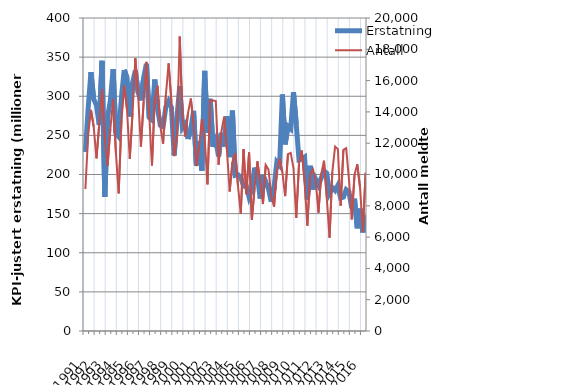
| Category | Erstatning |
|---|---|
| 1991.0 | 228.749 |
| nan | 284.604 |
| nan | 330.774 |
| nan | 296.254 |
| 1992.0 | 288.387 |
| nan | 263.506 |
| nan | 345.323 |
| nan | 171.267 |
| 1993.0 | 273.217 |
| nan | 294.381 |
| nan | 334.687 |
| nan | 252.715 |
| 1994.0 | 248.414 |
| nan | 299.114 |
| nan | 333.638 |
| nan | 323.684 |
| 1995.0 | 274.062 |
| nan | 317.038 |
| nan | 332.935 |
| nan | 304.87 |
| 1996.0 | 294.738 |
| nan | 323.554 |
| nan | 341.375 |
| nan | 272.922 |
| 1997.0 | 269.83 |
| nan | 321.383 |
| nan | 284.465 |
| nan | 262.977 |
| 1998.0 | 261.016 |
| nan | 286.331 |
| nan | 293.608 |
| nan | 285.708 |
| 1999.0 | 224.452 |
| nan | 272.35 |
| nan | 313.004 |
| nan | 259.609 |
| 2000.0 | 264.631 |
| nan | 245.415 |
| nan | 257.428 |
| nan | 281.433 |
| 2001.0 | 211.635 |
| nan | 242.737 |
| nan | 204.98 |
| nan | 332.459 |
| 2002.0 | 253.124 |
| nan | 296.757 |
| nan | 235.339 |
| nan | 244.335 |
| 2003.0 | 223.241 |
| nan | 252.96 |
| nan | 235.873 |
| nan | 274.261 |
| 2004.0 | 222.116 |
| nan | 281.572 |
| nan | 198.937 |
| nan | 199.767 |
| 2005.0 | 196.359 |
| nan | 185.065 |
| nan | 185.833 |
| nan | 171.134 |
| 2006.0 | 180.565 |
| nan | 208.811 |
| nan | 199.152 |
| nan | 169.287 |
| 2007.0 | 199.17 |
| nan | 190.26 |
| nan | 181.455 |
| nan | 165.26 |
| 2008.0 | 183.609 |
| nan | 215.888 |
| nan | 211.574 |
| nan | 302.246 |
| 2009.0 | 238.443 |
| nan | 261.694 |
| nan | 258.418 |
| nan | 305.219 |
| 2010.0 | 264.067 |
| nan | 218.648 |
| nan | 219.545 |
| nan | 222.163 |
| 2011.0 | 168.039 |
| nan | 211.087 |
| nan | 180.746 |
| nan | 194.01 |
| 2012.0 | 186.546 |
| nan | 195.537 |
| nan | 204.354 |
| nan | 201.669 |
| 2013.0 | 176.429 |
| nan | 183.382 |
| nan | 179.613 |
| nan | 186.09 |
| 2014.0 | 170.028 |
| nan | 171.115 |
| nan | 180.65 |
| nan | 177.838 |
| 2015.0 | 156.941 |
| nan | 169.095 |
| nan | 131.257 |
| nan | 156.432 |
| 2016.0 | 125.98 |
| nan | 147.855 |